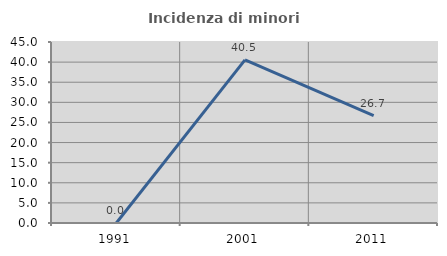
| Category | Incidenza di minori stranieri |
|---|---|
| 1991.0 | 0 |
| 2001.0 | 40.541 |
| 2011.0 | 26.667 |